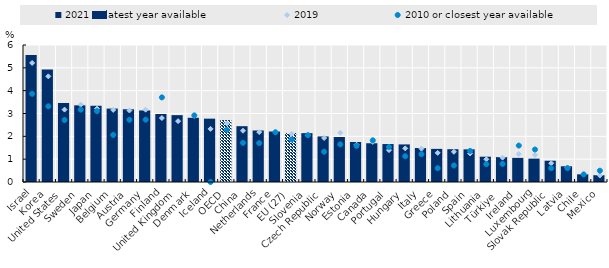
| Category | 2021 or latest year available |
|---|---|
| Israel | 5.557 |
| Korea | 4.93 |
| United States | 3.457 |
| Sweden | 3.358 |
| Japan | 3.339 |
| Belgium | 3.216 |
| Austria | 3.189 |
| Germany | 3.133 |
| Finland | 2.978 |
| United Kingdom | 2.928 |
| Denmark | 2.813 |
| Iceland | 2.774 |
| OECD | 2.711 |
| China | 2.444 |
| Netherlands | 2.256 |
| France | 2.212 |
| EU (27) | 2.148 |
| Slovenia | 2.139 |
| Czech Republic | 1.996 |
| Norway | 1.971 |
| Estonia | 1.752 |
| Canada | 1.697 |
| Portugal | 1.662 |
| Hungary | 1.646 |
| Italy | 1.488 |
| Greece | 1.451 |
| Poland | 1.436 |
| Spain | 1.429 |
| Lithuania | 1.108 |
| Türkiye  | 1.089 |
| Ireland | 1.056 |
| Luxembourg | 1.023 |
| Slovak Republic | 0.932 |
| Latvia | 0.689 |
| Chile | 0.337 |
| Mexico | 0.297 |